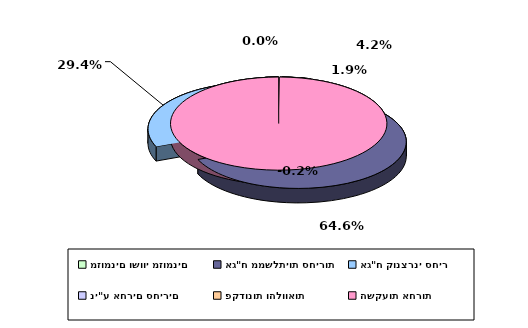
| Category | Series 0 |
|---|---|
| מזומנים ושווי מזומנים | 0.042 |
| אג"ח ממשלתיות סחירות | 0.646 |
| אג"ח קונצרני סחיר | 0.294 |
| ני"ע אחרים סחירים | 0.019 |
| פקדונות והלוואות | 0 |
| השקעות אחרות | -0.002 |